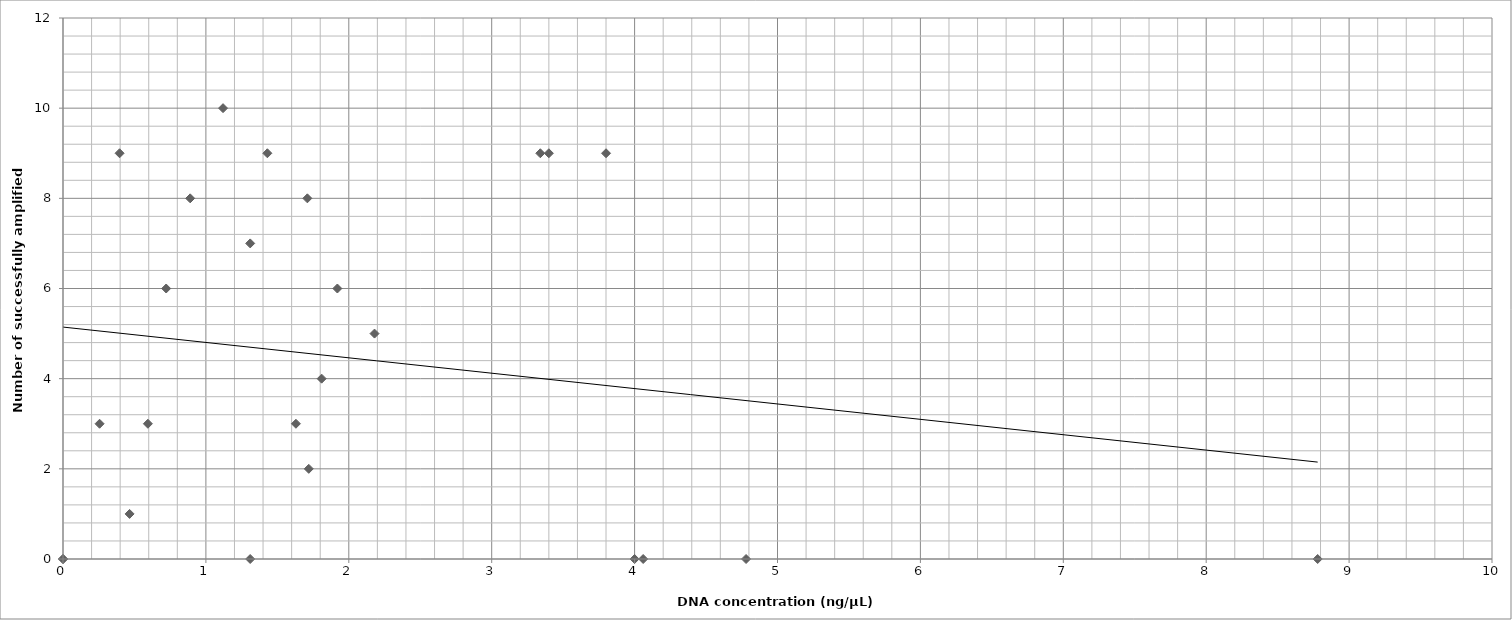
| Category | Series 0 |
|---|---|
| 0.0 | 0 |
| 0.0 | 0 |
| 1.31 | 0 |
| 4.0 | 0 |
| 4.06 | 0 |
| 4.78 | 0 |
| 8.78 | 0 |
| 0.466 | 1 |
| 1.72 | 2 |
| 0.256 | 3 |
| 0.594 | 3 |
| 1.63 | 3 |
| 1.81 | 4 |
| 2.18 | 5 |
| 0.722 | 6 |
| 1.92 | 6 |
| 1.31 | 7 |
| 0.89 | 8 |
| 1.71 | 8 |
| 0.396 | 9 |
| 1.43 | 9 |
| 3.34 | 9 |
| 3.4 | 9 |
| 3.8 | 9 |
| 1.12 | 10 |